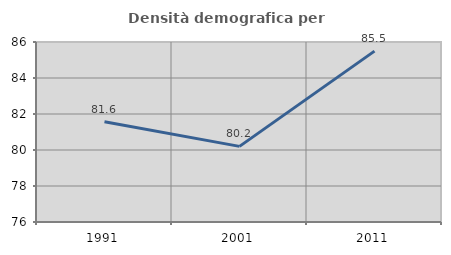
| Category | Densità demografica |
|---|---|
| 1991.0 | 81.573 |
| 2001.0 | 80.202 |
| 2011.0 | 85.492 |